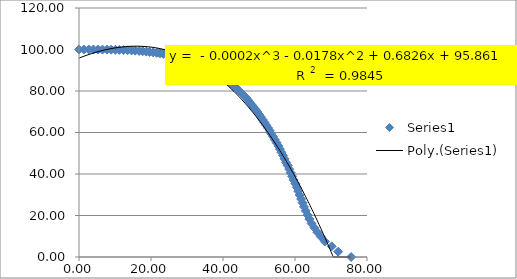
| Category | Series 0 |
|---|---|
| 0.0 | 100 |
| 1.36 | 100 |
| 2.71 | 100 |
| 4.0 | 99.99 |
| 5.29 | 99.98 |
| 6.52 | 99.96 |
| 7.76 | 99.94 |
| 8.93 | 99.91 |
| 10.1 | 99.86 |
| 11.2 | 99.8 |
| 12.4 | 99.72 |
| 13.5 | 99.65 |
| 14.6 | 99.54 |
| 15.6 | 99.44 |
| 16.7 | 99.3 |
| 17.7 | 99.16 |
| 18.7 | 98.99 |
| 19.6 | 98.82 |
| 20.6 | 98.61 |
| 21.6 | 98.4 |
| 22.5 | 98.14 |
| 23.4 | 97.89 |
| 24.3 | 97.6 |
| 25.2 | 97.31 |
| 26.1 | 96.97 |
| 27.0 | 96.63 |
| 27.8 | 96.25 |
| 28.6 | 95.87 |
| 29.5 | 95.44 |
| 30.3 | 95 |
| 31.1 | 94.52 |
| 31.8 | 94.05 |
| 32.6 | 93.52 |
| 33.4 | 92.99 |
| 34.2 | 92.41 |
| 35.0 | 91.83 |
| 35.7 | 91.2 |
| 36.4 | 90.57 |
| 37.1 | 89.88 |
| 37.8 | 89.2 |
| 38.5 | 88.46 |
| 39.2 | 87.73 |
| 39.8 | 86.94 |
| 40.4 | 86.16 |
| 41.0 | 85.33 |
| 41.6 | 84.5 |
| 42.3 | 83.61 |
| 42.9 | 82.72 |
| 43.5 | 81.78 |
| 44.0 | 80.85 |
| 44.6 | 79.86 |
| 45.2 | 78.87 |
| 45.8 | 77.83 |
| 46.4 | 76.79 |
| 46.9 | 75.7 |
| 47.4 | 74.61 |
| 47.9 | 73.48 |
| 48.4 | 72.34 |
| 49.0 | 71.15 |
| 49.5 | 69.96 |
| 50.0 | 68.72 |
| 50.5 | 67.48 |
| 51.0 | 66.19 |
| 51.5 | 64.9 |
| 52.0 | 63.56 |
| 52.5 | 62.22 |
| 53.0 | 60.82 |
| 53.4 | 59.43 |
| 53.9 | 57.99 |
| 54.4 | 56.55 |
| 54.9 | 55.06 |
| 55.4 | 53.56 |
| 55.8 | 52.02 |
| 56.2 | 50.48 |
| 56.7 | 48.88 |
| 57.1 | 47.29 |
| 57.5 | 45.65 |
| 58.0 | 44.01 |
| 58.4 | 42.32 |
| 58.8 | 40.63 |
| 59.2 | 38.89 |
| 59.6 | 37.15 |
| 60.1 | 35.36 |
| 60.5 | 33.57 |
| 60.9 | 31.73 |
| 61.3 | 29.89 |
| 61.7 | 28 |
| 62.1 | 26.12 |
| 62.5 | 24.18 |
| 63.0 | 22.25 |
| 63.5 | 20.25 |
| 64.0 | 18.25 |
| 64.6 | 16.18 |
| 65.4 | 14.11 |
| 66.2 | 11.94 |
| 67.2 | 9.77 |
| 68.3 | 7.46 |
| 70.2 | 5.14 |
| 72.0 | 2.57 |
| 75.6 | 0 |